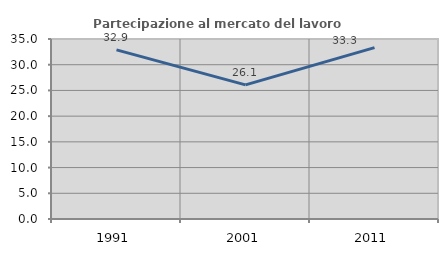
| Category | Partecipazione al mercato del lavoro  femminile |
|---|---|
| 1991.0 | 32.877 |
| 2001.0 | 26.087 |
| 2011.0 | 33.333 |